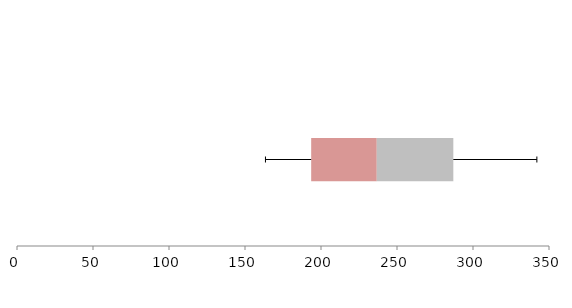
| Category | Series 1 | Series 2 | Series 3 |
|---|---|---|---|
| 0 | 193.542 | 43.157 | 50.359 |